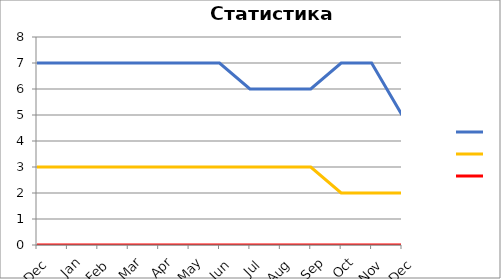
| Category | Series 1 | Series 0 | Series 2 |
|---|---|---|---|
| 0 | 7 | 3 | 0 |
| 1 | 7 | 3 | 0 |
| 2 | 7 | 3 | 0 |
| 3 | 7 | 3 | 0 |
| 4 | 7 | 3 | 0 |
| 5 | 7 | 3 | 0 |
| 6 | 7 | 3 | 0 |
| 7 | 6 | 3 | 0 |
| 8 | 6 | 3 | 0 |
| 9 | 6 | 3 | 0 |
| 10 | 7 | 2 | 0 |
| 11 | 7 | 2 | 0 |
| 12 | 5 | 2 | 0 |